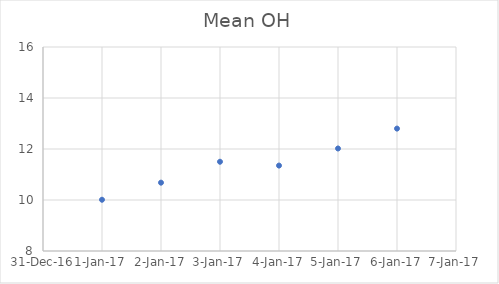
| Category | Mean OH |
|---|---|
| 42736.0 | 10.01 |
| 42737.0 | 10.68 |
| 42738.0 | 11.5 |
| 42739.0 | 11.35 |
| 42740.0 | 12.02 |
| 42741.0 | 12.8 |